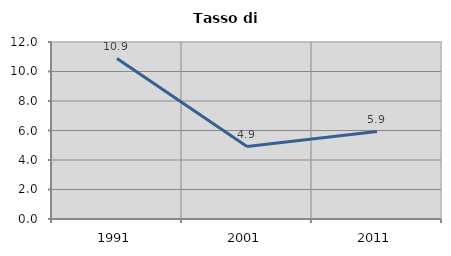
| Category | Tasso di disoccupazione   |
|---|---|
| 1991.0 | 10.881 |
| 2001.0 | 4.911 |
| 2011.0 | 5.926 |